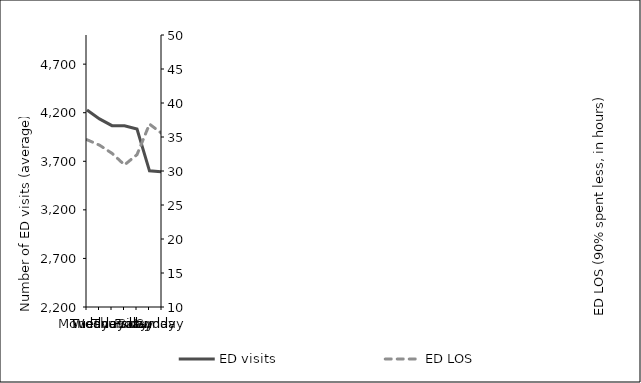
| Category | ED visits |
|---|---|
| Monday | 4227 |
| Tuesday | 4136 |
| Wednesday | 4067 |
| Thursday | 4066 |
| Friday | 4032 |
| Saturday | 3602 |
| Sunday | 3591 |